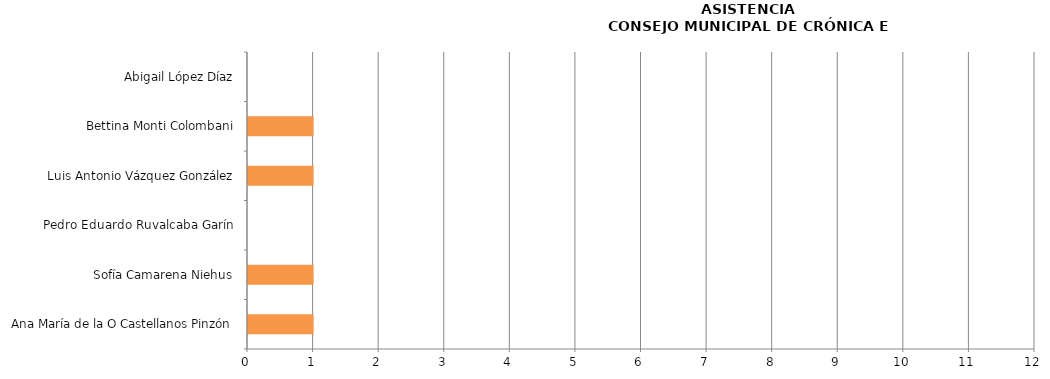
| Category | Series 0 |
|---|---|
| Ana María de la O Castellanos Pinzón | 1 |
| Sofía Camarena Niehus | 1 |
| Pedro Eduardo Ruvalcaba Garín | 0 |
| Luis Antonio Vázquez González | 1 |
| Bettina Monti Colombani | 1 |
| Abigail López Díaz | 0 |